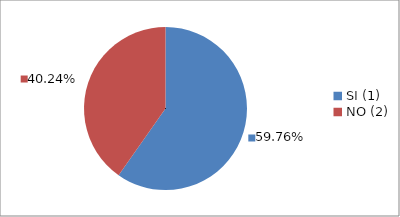
| Category | Series 0 |
|---|---|
| SI (1) | 0.598 |
| NO (2) | 0.402 |